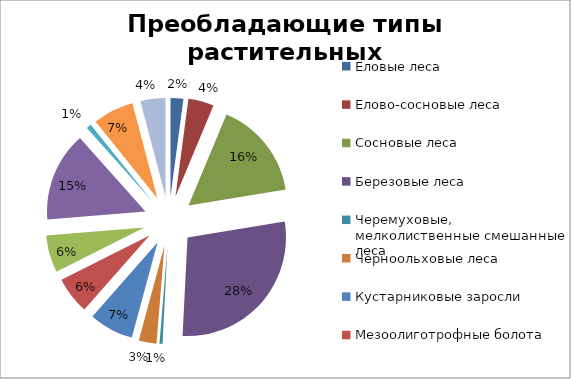
| Category | Series 0 |
|---|---|
| Еловые леса | 2.1 |
| Елово-сосновые леса | 4.2 |
| Сосновые леса | 16.1 |
| Березовые леса | 28.4 |
| Черемуховые, мелколиственные смешанные леса | 0.5 |
| Черноольховые леса | 2.9 |
| Кустарниковые заросли | 7.3 |
| Мезоолиготрофные болота | 6.1 |
| Мезотрофные болота | 6.1 |
| Мезоевтрофные и евтрофные болота | 14.7 |
| Луговая растительность | 0.8 |
| Прибрежно-водная и водная растительность | 6.7 |
| Растительность на нарушенных субстратах | 4.1 |